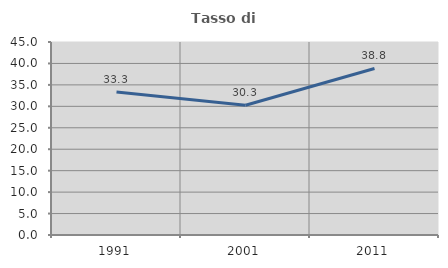
| Category | Tasso di occupazione   |
|---|---|
| 1991.0 | 33.333 |
| 2001.0 | 30.252 |
| 2011.0 | 38.835 |